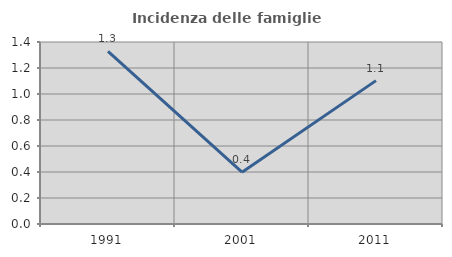
| Category | Incidenza delle famiglie numerose |
|---|---|
| 1991.0 | 1.327 |
| 2001.0 | 0.398 |
| 2011.0 | 1.103 |